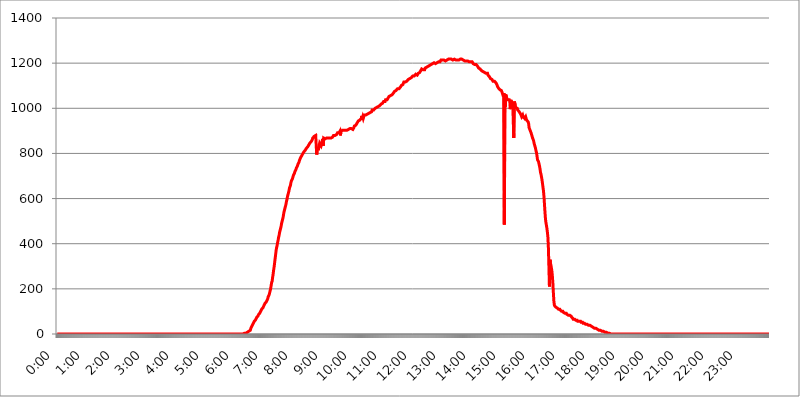
| Category | 2015.09.21. Intenzitás [W/m^2] |
|---|---|
| 0.0 | 0 |
| 0.0006944444444444445 | 0 |
| 0.001388888888888889 | 0 |
| 0.0020833333333333333 | 0 |
| 0.002777777777777778 | 0 |
| 0.003472222222222222 | 0 |
| 0.004166666666666667 | 0 |
| 0.004861111111111111 | 0 |
| 0.005555555555555556 | 0 |
| 0.0062499999999999995 | 0 |
| 0.006944444444444444 | 0 |
| 0.007638888888888889 | 0 |
| 0.008333333333333333 | 0 |
| 0.009027777777777779 | 0 |
| 0.009722222222222222 | 0 |
| 0.010416666666666666 | 0 |
| 0.011111111111111112 | 0 |
| 0.011805555555555555 | 0 |
| 0.012499999999999999 | 0 |
| 0.013194444444444444 | 0 |
| 0.013888888888888888 | 0 |
| 0.014583333333333332 | 0 |
| 0.015277777777777777 | 0 |
| 0.015972222222222224 | 0 |
| 0.016666666666666666 | 0 |
| 0.017361111111111112 | 0 |
| 0.018055555555555557 | 0 |
| 0.01875 | 0 |
| 0.019444444444444445 | 0 |
| 0.02013888888888889 | 0 |
| 0.020833333333333332 | 0 |
| 0.02152777777777778 | 0 |
| 0.022222222222222223 | 0 |
| 0.02291666666666667 | 0 |
| 0.02361111111111111 | 0 |
| 0.024305555555555556 | 0 |
| 0.024999999999999998 | 0 |
| 0.025694444444444447 | 0 |
| 0.02638888888888889 | 0 |
| 0.027083333333333334 | 0 |
| 0.027777777777777776 | 0 |
| 0.02847222222222222 | 0 |
| 0.029166666666666664 | 0 |
| 0.029861111111111113 | 0 |
| 0.030555555555555555 | 0 |
| 0.03125 | 0 |
| 0.03194444444444445 | 0 |
| 0.03263888888888889 | 0 |
| 0.03333333333333333 | 0 |
| 0.034027777777777775 | 0 |
| 0.034722222222222224 | 0 |
| 0.035416666666666666 | 0 |
| 0.036111111111111115 | 0 |
| 0.03680555555555556 | 0 |
| 0.0375 | 0 |
| 0.03819444444444444 | 0 |
| 0.03888888888888889 | 0 |
| 0.03958333333333333 | 0 |
| 0.04027777777777778 | 0 |
| 0.04097222222222222 | 0 |
| 0.041666666666666664 | 0 |
| 0.042361111111111106 | 0 |
| 0.04305555555555556 | 0 |
| 0.043750000000000004 | 0 |
| 0.044444444444444446 | 0 |
| 0.04513888888888889 | 0 |
| 0.04583333333333334 | 0 |
| 0.04652777777777778 | 0 |
| 0.04722222222222222 | 0 |
| 0.04791666666666666 | 0 |
| 0.04861111111111111 | 0 |
| 0.049305555555555554 | 0 |
| 0.049999999999999996 | 0 |
| 0.05069444444444445 | 0 |
| 0.051388888888888894 | 0 |
| 0.052083333333333336 | 0 |
| 0.05277777777777778 | 0 |
| 0.05347222222222222 | 0 |
| 0.05416666666666667 | 0 |
| 0.05486111111111111 | 0 |
| 0.05555555555555555 | 0 |
| 0.05625 | 0 |
| 0.05694444444444444 | 0 |
| 0.057638888888888885 | 0 |
| 0.05833333333333333 | 0 |
| 0.05902777777777778 | 0 |
| 0.059722222222222225 | 0 |
| 0.06041666666666667 | 0 |
| 0.061111111111111116 | 0 |
| 0.06180555555555556 | 0 |
| 0.0625 | 0 |
| 0.06319444444444444 | 0 |
| 0.06388888888888888 | 0 |
| 0.06458333333333334 | 0 |
| 0.06527777777777778 | 0 |
| 0.06597222222222222 | 0 |
| 0.06666666666666667 | 0 |
| 0.06736111111111111 | 0 |
| 0.06805555555555555 | 0 |
| 0.06874999999999999 | 0 |
| 0.06944444444444443 | 0 |
| 0.07013888888888889 | 0 |
| 0.07083333333333333 | 0 |
| 0.07152777777777779 | 0 |
| 0.07222222222222223 | 0 |
| 0.07291666666666667 | 0 |
| 0.07361111111111111 | 0 |
| 0.07430555555555556 | 0 |
| 0.075 | 0 |
| 0.07569444444444444 | 0 |
| 0.0763888888888889 | 0 |
| 0.07708333333333334 | 0 |
| 0.07777777777777778 | 0 |
| 0.07847222222222222 | 0 |
| 0.07916666666666666 | 0 |
| 0.0798611111111111 | 0 |
| 0.08055555555555556 | 0 |
| 0.08125 | 0 |
| 0.08194444444444444 | 0 |
| 0.08263888888888889 | 0 |
| 0.08333333333333333 | 0 |
| 0.08402777777777777 | 0 |
| 0.08472222222222221 | 0 |
| 0.08541666666666665 | 0 |
| 0.08611111111111112 | 0 |
| 0.08680555555555557 | 0 |
| 0.08750000000000001 | 0 |
| 0.08819444444444445 | 0 |
| 0.08888888888888889 | 0 |
| 0.08958333333333333 | 0 |
| 0.09027777777777778 | 0 |
| 0.09097222222222222 | 0 |
| 0.09166666666666667 | 0 |
| 0.09236111111111112 | 0 |
| 0.09305555555555556 | 0 |
| 0.09375 | 0 |
| 0.09444444444444444 | 0 |
| 0.09513888888888888 | 0 |
| 0.09583333333333333 | 0 |
| 0.09652777777777777 | 0 |
| 0.09722222222222222 | 0 |
| 0.09791666666666667 | 0 |
| 0.09861111111111111 | 0 |
| 0.09930555555555555 | 0 |
| 0.09999999999999999 | 0 |
| 0.10069444444444443 | 0 |
| 0.1013888888888889 | 0 |
| 0.10208333333333335 | 0 |
| 0.10277777777777779 | 0 |
| 0.10347222222222223 | 0 |
| 0.10416666666666667 | 0 |
| 0.10486111111111111 | 0 |
| 0.10555555555555556 | 0 |
| 0.10625 | 0 |
| 0.10694444444444444 | 0 |
| 0.1076388888888889 | 0 |
| 0.10833333333333334 | 0 |
| 0.10902777777777778 | 0 |
| 0.10972222222222222 | 0 |
| 0.1111111111111111 | 0 |
| 0.11180555555555556 | 0 |
| 0.11180555555555556 | 0 |
| 0.1125 | 0 |
| 0.11319444444444444 | 0 |
| 0.11388888888888889 | 0 |
| 0.11458333333333333 | 0 |
| 0.11527777777777777 | 0 |
| 0.11597222222222221 | 0 |
| 0.11666666666666665 | 0 |
| 0.1173611111111111 | 0 |
| 0.11805555555555557 | 0 |
| 0.11944444444444445 | 0 |
| 0.12013888888888889 | 0 |
| 0.12083333333333333 | 0 |
| 0.12152777777777778 | 0 |
| 0.12222222222222223 | 0 |
| 0.12291666666666667 | 0 |
| 0.12291666666666667 | 0 |
| 0.12361111111111112 | 0 |
| 0.12430555555555556 | 0 |
| 0.125 | 0 |
| 0.12569444444444444 | 0 |
| 0.12638888888888888 | 0 |
| 0.12708333333333333 | 0 |
| 0.16875 | 0 |
| 0.12847222222222224 | 0 |
| 0.12916666666666668 | 0 |
| 0.12986111111111112 | 0 |
| 0.13055555555555556 | 0 |
| 0.13125 | 0 |
| 0.13194444444444445 | 0 |
| 0.1326388888888889 | 0 |
| 0.13333333333333333 | 0 |
| 0.13402777777777777 | 0 |
| 0.13402777777777777 | 0 |
| 0.13472222222222222 | 0 |
| 0.13541666666666666 | 0 |
| 0.1361111111111111 | 0 |
| 0.13749999999999998 | 0 |
| 0.13819444444444443 | 0 |
| 0.1388888888888889 | 0 |
| 0.13958333333333334 | 0 |
| 0.14027777777777778 | 0 |
| 0.14097222222222222 | 0 |
| 0.14166666666666666 | 0 |
| 0.1423611111111111 | 0 |
| 0.14305555555555557 | 0 |
| 0.14375000000000002 | 0 |
| 0.14444444444444446 | 0 |
| 0.1451388888888889 | 0 |
| 0.1451388888888889 | 0 |
| 0.14652777777777778 | 0 |
| 0.14722222222222223 | 0 |
| 0.14791666666666667 | 0 |
| 0.1486111111111111 | 0 |
| 0.14930555555555555 | 0 |
| 0.15 | 0 |
| 0.15069444444444444 | 0 |
| 0.15138888888888888 | 0 |
| 0.15208333333333332 | 0 |
| 0.15277777777777776 | 0 |
| 0.15347222222222223 | 0 |
| 0.15416666666666667 | 0 |
| 0.15486111111111112 | 0 |
| 0.15555555555555556 | 0 |
| 0.15625 | 0 |
| 0.15694444444444444 | 0 |
| 0.15763888888888888 | 0 |
| 0.15833333333333333 | 0 |
| 0.15902777777777777 | 0 |
| 0.15972222222222224 | 0 |
| 0.16041666666666668 | 0 |
| 0.16111111111111112 | 0 |
| 0.16180555555555556 | 0 |
| 0.1625 | 0 |
| 0.16319444444444445 | 0 |
| 0.1638888888888889 | 0 |
| 0.16458333333333333 | 0 |
| 0.16527777777777777 | 0 |
| 0.16597222222222222 | 0 |
| 0.16666666666666666 | 0 |
| 0.1673611111111111 | 0 |
| 0.16805555555555554 | 0 |
| 0.16874999999999998 | 0 |
| 0.16944444444444443 | 0 |
| 0.17013888888888887 | 0 |
| 0.1708333333333333 | 0 |
| 0.17152777777777775 | 0 |
| 0.17222222222222225 | 0 |
| 0.1729166666666667 | 0 |
| 0.17361111111111113 | 0 |
| 0.17430555555555557 | 0 |
| 0.17500000000000002 | 0 |
| 0.17569444444444446 | 0 |
| 0.1763888888888889 | 0 |
| 0.17708333333333334 | 0 |
| 0.17777777777777778 | 0 |
| 0.17847222222222223 | 0 |
| 0.17916666666666667 | 0 |
| 0.1798611111111111 | 0 |
| 0.18055555555555555 | 0 |
| 0.18125 | 0 |
| 0.18194444444444444 | 0 |
| 0.1826388888888889 | 0 |
| 0.18333333333333335 | 0 |
| 0.1840277777777778 | 0 |
| 0.18472222222222223 | 0 |
| 0.18541666666666667 | 0 |
| 0.18611111111111112 | 0 |
| 0.18680555555555556 | 0 |
| 0.1875 | 0 |
| 0.18819444444444444 | 0 |
| 0.18888888888888888 | 0 |
| 0.18958333333333333 | 0 |
| 0.19027777777777777 | 0 |
| 0.1909722222222222 | 0 |
| 0.19166666666666665 | 0 |
| 0.19236111111111112 | 0 |
| 0.19305555555555554 | 0 |
| 0.19375 | 0 |
| 0.19444444444444445 | 0 |
| 0.1951388888888889 | 0 |
| 0.19583333333333333 | 0 |
| 0.19652777777777777 | 0 |
| 0.19722222222222222 | 0 |
| 0.19791666666666666 | 0 |
| 0.1986111111111111 | 0 |
| 0.19930555555555554 | 0 |
| 0.19999999999999998 | 0 |
| 0.20069444444444443 | 0 |
| 0.20138888888888887 | 0 |
| 0.2020833333333333 | 0 |
| 0.2027777777777778 | 0 |
| 0.2034722222222222 | 0 |
| 0.2041666666666667 | 0 |
| 0.20486111111111113 | 0 |
| 0.20555555555555557 | 0 |
| 0.20625000000000002 | 0 |
| 0.20694444444444446 | 0 |
| 0.2076388888888889 | 0 |
| 0.20833333333333334 | 0 |
| 0.20902777777777778 | 0 |
| 0.20972222222222223 | 0 |
| 0.21041666666666667 | 0 |
| 0.2111111111111111 | 0 |
| 0.21180555555555555 | 0 |
| 0.2125 | 0 |
| 0.21319444444444444 | 0 |
| 0.2138888888888889 | 0 |
| 0.21458333333333335 | 0 |
| 0.2152777777777778 | 0 |
| 0.21597222222222223 | 0 |
| 0.21666666666666667 | 0 |
| 0.21736111111111112 | 0 |
| 0.21805555555555556 | 0 |
| 0.21875 | 0 |
| 0.21944444444444444 | 0 |
| 0.22013888888888888 | 0 |
| 0.22083333333333333 | 0 |
| 0.22152777777777777 | 0 |
| 0.2222222222222222 | 0 |
| 0.22291666666666665 | 0 |
| 0.2236111111111111 | 0 |
| 0.22430555555555556 | 0 |
| 0.225 | 0 |
| 0.22569444444444445 | 0 |
| 0.2263888888888889 | 0 |
| 0.22708333333333333 | 0 |
| 0.22777777777777777 | 0 |
| 0.22847222222222222 | 0 |
| 0.22916666666666666 | 0 |
| 0.2298611111111111 | 0 |
| 0.23055555555555554 | 0 |
| 0.23124999999999998 | 0 |
| 0.23194444444444443 | 0 |
| 0.23263888888888887 | 0 |
| 0.2333333333333333 | 0 |
| 0.2340277777777778 | 0 |
| 0.2347222222222222 | 0 |
| 0.2354166666666667 | 0 |
| 0.23611111111111113 | 0 |
| 0.23680555555555557 | 0 |
| 0.23750000000000002 | 0 |
| 0.23819444444444446 | 0 |
| 0.2388888888888889 | 0 |
| 0.23958333333333334 | 0 |
| 0.24027777777777778 | 0 |
| 0.24097222222222223 | 0 |
| 0.24166666666666667 | 0 |
| 0.2423611111111111 | 0 |
| 0.24305555555555555 | 0 |
| 0.24375 | 0 |
| 0.24444444444444446 | 0 |
| 0.24513888888888888 | 0 |
| 0.24583333333333335 | 0 |
| 0.2465277777777778 | 0 |
| 0.24722222222222223 | 0 |
| 0.24791666666666667 | 0 |
| 0.24861111111111112 | 0 |
| 0.24930555555555556 | 0 |
| 0.25 | 0 |
| 0.25069444444444444 | 0 |
| 0.2513888888888889 | 0 |
| 0.2520833333333333 | 0 |
| 0.25277777777777777 | 0 |
| 0.2534722222222222 | 0 |
| 0.25416666666666665 | 0 |
| 0.2548611111111111 | 0 |
| 0.2555555555555556 | 0 |
| 0.25625000000000003 | 0 |
| 0.2569444444444445 | 0 |
| 0.2576388888888889 | 0 |
| 0.25833333333333336 | 0 |
| 0.2590277777777778 | 0 |
| 0.25972222222222224 | 0 |
| 0.2604166666666667 | 0 |
| 0.2611111111111111 | 0 |
| 0.26180555555555557 | 3.525 |
| 0.2625 | 3.525 |
| 0.26319444444444445 | 3.525 |
| 0.2638888888888889 | 3.525 |
| 0.26458333333333334 | 3.525 |
| 0.2652777777777778 | 3.525 |
| 0.2659722222222222 | 3.525 |
| 0.26666666666666666 | 7.887 |
| 0.2673611111111111 | 7.887 |
| 0.26805555555555555 | 7.887 |
| 0.26875 | 12.257 |
| 0.26944444444444443 | 12.257 |
| 0.2701388888888889 | 12.257 |
| 0.2708333333333333 | 16.636 |
| 0.27152777777777776 | 25.419 |
| 0.2722222222222222 | 25.419 |
| 0.27291666666666664 | 29.823 |
| 0.2736111111111111 | 38.653 |
| 0.2743055555555555 | 43.079 |
| 0.27499999999999997 | 47.511 |
| 0.27569444444444446 | 51.951 |
| 0.27638888888888885 | 56.398 |
| 0.27708333333333335 | 56.398 |
| 0.2777777777777778 | 60.85 |
| 0.27847222222222223 | 65.31 |
| 0.2791666666666667 | 69.775 |
| 0.2798611111111111 | 74.246 |
| 0.28055555555555556 | 74.246 |
| 0.28125 | 78.722 |
| 0.28194444444444444 | 83.205 |
| 0.2826388888888889 | 87.692 |
| 0.2833333333333333 | 87.692 |
| 0.28402777777777777 | 92.184 |
| 0.2847222222222222 | 96.682 |
| 0.28541666666666665 | 101.184 |
| 0.28611111111111115 | 105.69 |
| 0.28680555555555554 | 110.201 |
| 0.28750000000000003 | 110.201 |
| 0.2881944444444445 | 114.716 |
| 0.2888888888888889 | 119.235 |
| 0.28958333333333336 | 123.758 |
| 0.2902777777777778 | 128.284 |
| 0.29097222222222224 | 128.284 |
| 0.2916666666666667 | 137.347 |
| 0.2923611111111111 | 137.347 |
| 0.29305555555555557 | 141.884 |
| 0.29375 | 146.423 |
| 0.29444444444444445 | 150.964 |
| 0.2951388888888889 | 155.509 |
| 0.29583333333333334 | 164.605 |
| 0.2965277777777778 | 164.605 |
| 0.2972222222222222 | 173.709 |
| 0.29791666666666666 | 182.82 |
| 0.2986111111111111 | 191.937 |
| 0.29930555555555555 | 201.058 |
| 0.3 | 214.746 |
| 0.30069444444444443 | 228.436 |
| 0.3013888888888889 | 233 |
| 0.3020833333333333 | 251.251 |
| 0.30277777777777776 | 264.932 |
| 0.3034722222222222 | 283.156 |
| 0.30416666666666664 | 296.808 |
| 0.3048611111111111 | 314.98 |
| 0.3055555555555555 | 333.113 |
| 0.30624999999999997 | 351.198 |
| 0.3069444444444444 | 369.23 |
| 0.3076388888888889 | 382.715 |
| 0.30833333333333335 | 391.685 |
| 0.3090277777777778 | 405.108 |
| 0.30972222222222223 | 414.035 |
| 0.3104166666666667 | 427.39 |
| 0.3111111111111111 | 436.27 |
| 0.31180555555555556 | 449.551 |
| 0.3125 | 453.968 |
| 0.31319444444444444 | 467.187 |
| 0.3138888888888889 | 475.972 |
| 0.3145833333333333 | 489.108 |
| 0.31527777777777777 | 497.836 |
| 0.3159722222222222 | 506.542 |
| 0.31666666666666665 | 515.223 |
| 0.31736111111111115 | 528.2 |
| 0.31805555555555554 | 541.121 |
| 0.31875000000000003 | 549.704 |
| 0.3194444444444445 | 558.261 |
| 0.3201388888888889 | 566.793 |
| 0.32083333333333336 | 575.299 |
| 0.3215277777777778 | 588.009 |
| 0.32222222222222224 | 596.45 |
| 0.3229166666666667 | 609.062 |
| 0.3236111111111111 | 617.436 |
| 0.32430555555555557 | 625.784 |
| 0.325 | 634.105 |
| 0.32569444444444445 | 646.537 |
| 0.3263888888888889 | 650.667 |
| 0.32708333333333334 | 658.909 |
| 0.3277777777777778 | 671.22 |
| 0.3284722222222222 | 679.395 |
| 0.32916666666666666 | 683.473 |
| 0.3298611111111111 | 687.544 |
| 0.33055555555555555 | 695.666 |
| 0.33125 | 703.762 |
| 0.33194444444444443 | 707.8 |
| 0.3326388888888889 | 711.832 |
| 0.3333333333333333 | 719.877 |
| 0.3340277777777778 | 719.877 |
| 0.3347222222222222 | 727.896 |
| 0.3354166666666667 | 735.89 |
| 0.3361111111111111 | 739.877 |
| 0.3368055555555556 | 743.859 |
| 0.33749999999999997 | 751.803 |
| 0.33819444444444446 | 755.766 |
| 0.33888888888888885 | 759.723 |
| 0.33958333333333335 | 767.62 |
| 0.34027777777777773 | 767.62 |
| 0.34097222222222223 | 779.42 |
| 0.3416666666666666 | 783.342 |
| 0.3423611111111111 | 783.342 |
| 0.3430555555555555 | 791.169 |
| 0.34375 | 795.074 |
| 0.3444444444444445 | 798.974 |
| 0.3451388888888889 | 802.868 |
| 0.3458333333333334 | 806.757 |
| 0.34652777777777777 | 810.641 |
| 0.34722222222222227 | 810.641 |
| 0.34791666666666665 | 814.519 |
| 0.34861111111111115 | 818.392 |
| 0.34930555555555554 | 822.26 |
| 0.35000000000000003 | 826.123 |
| 0.3506944444444444 | 826.123 |
| 0.3513888888888889 | 829.981 |
| 0.3520833333333333 | 833.834 |
| 0.3527777777777778 | 837.682 |
| 0.3534722222222222 | 841.526 |
| 0.3541666666666667 | 845.365 |
| 0.3548611111111111 | 849.199 |
| 0.35555555555555557 | 849.199 |
| 0.35625 | 853.029 |
| 0.35694444444444445 | 856.855 |
| 0.3576388888888889 | 860.676 |
| 0.35833333333333334 | 868.305 |
| 0.3590277777777778 | 868.305 |
| 0.3597222222222222 | 872.114 |
| 0.36041666666666666 | 875.918 |
| 0.3611111111111111 | 875.918 |
| 0.36180555555555555 | 879.719 |
| 0.3625 | 879.719 |
| 0.36319444444444443 | 879.719 |
| 0.3638888888888889 | 795.074 |
| 0.3645833333333333 | 818.392 |
| 0.3652777777777778 | 826.123 |
| 0.3659722222222222 | 814.519 |
| 0.3666666666666667 | 818.392 |
| 0.3673611111111111 | 833.834 |
| 0.3680555555555556 | 845.365 |
| 0.36874999999999997 | 845.365 |
| 0.36944444444444446 | 845.365 |
| 0.37013888888888885 | 833.834 |
| 0.37083333333333335 | 841.526 |
| 0.37152777777777773 | 845.365 |
| 0.37222222222222223 | 864.493 |
| 0.3729166666666666 | 833.834 |
| 0.3736111111111111 | 868.305 |
| 0.3743055555555555 | 868.305 |
| 0.375 | 864.493 |
| 0.3756944444444445 | 864.493 |
| 0.3763888888888889 | 868.305 |
| 0.3770833333333334 | 864.493 |
| 0.37777777777777777 | 868.305 |
| 0.37847222222222227 | 868.305 |
| 0.37916666666666665 | 868.305 |
| 0.37986111111111115 | 868.305 |
| 0.38055555555555554 | 864.493 |
| 0.38125000000000003 | 868.305 |
| 0.3819444444444444 | 868.305 |
| 0.3826388888888889 | 872.114 |
| 0.3833333333333333 | 872.114 |
| 0.3840277777777778 | 868.305 |
| 0.3847222222222222 | 872.114 |
| 0.3854166666666667 | 872.114 |
| 0.3861111111111111 | 872.114 |
| 0.38680555555555557 | 875.918 |
| 0.3875 | 879.719 |
| 0.38819444444444445 | 879.719 |
| 0.3888888888888889 | 879.719 |
| 0.38958333333333334 | 879.719 |
| 0.3902777777777778 | 883.516 |
| 0.3909722222222222 | 883.516 |
| 0.39166666666666666 | 883.516 |
| 0.3923611111111111 | 887.309 |
| 0.39305555555555555 | 891.099 |
| 0.39375 | 891.099 |
| 0.39444444444444443 | 894.885 |
| 0.3951388888888889 | 891.099 |
| 0.3958333333333333 | 894.885 |
| 0.3965277777777778 | 898.668 |
| 0.3972222222222222 | 879.719 |
| 0.3979166666666667 | 898.668 |
| 0.3986111111111111 | 898.668 |
| 0.3993055555555556 | 902.447 |
| 0.39999999999999997 | 902.447 |
| 0.40069444444444446 | 902.447 |
| 0.40138888888888885 | 898.668 |
| 0.40208333333333335 | 902.447 |
| 0.40277777777777773 | 902.447 |
| 0.40347222222222223 | 906.223 |
| 0.4041666666666666 | 902.447 |
| 0.4048611111111111 | 906.223 |
| 0.4055555555555555 | 906.223 |
| 0.40625 | 902.447 |
| 0.4069444444444445 | 902.447 |
| 0.4076388888888889 | 902.447 |
| 0.4083333333333334 | 906.223 |
| 0.40902777777777777 | 906.223 |
| 0.40972222222222227 | 906.223 |
| 0.41041666666666665 | 909.996 |
| 0.41111111111111115 | 909.996 |
| 0.41180555555555554 | 906.223 |
| 0.41250000000000003 | 909.996 |
| 0.4131944444444444 | 909.996 |
| 0.4138888888888889 | 913.766 |
| 0.4145833333333333 | 906.223 |
| 0.4152777777777778 | 906.223 |
| 0.4159722222222222 | 913.766 |
| 0.4166666666666667 | 921.298 |
| 0.4173611111111111 | 917.534 |
| 0.41805555555555557 | 921.298 |
| 0.41875 | 925.06 |
| 0.41944444444444445 | 928.819 |
| 0.4201388888888889 | 932.576 |
| 0.42083333333333334 | 928.819 |
| 0.4215277777777778 | 936.33 |
| 0.4222222222222222 | 943.832 |
| 0.42291666666666666 | 940.082 |
| 0.4236111111111111 | 947.58 |
| 0.42430555555555555 | 947.58 |
| 0.425 | 951.327 |
| 0.42569444444444443 | 947.58 |
| 0.4263888888888889 | 955.071 |
| 0.4270833333333333 | 966.295 |
| 0.4277777777777778 | 955.071 |
| 0.4284722222222222 | 962.555 |
| 0.4291666666666667 | 955.071 |
| 0.4298611111111111 | 958.814 |
| 0.4305555555555556 | 970.034 |
| 0.43124999999999997 | 970.034 |
| 0.43194444444444446 | 970.034 |
| 0.43263888888888885 | 970.034 |
| 0.43333333333333335 | 970.034 |
| 0.43402777777777773 | 973.772 |
| 0.43472222222222223 | 973.772 |
| 0.4354166666666666 | 977.508 |
| 0.4361111111111111 | 977.508 |
| 0.4368055555555555 | 977.508 |
| 0.4375 | 977.508 |
| 0.4381944444444445 | 981.244 |
| 0.4388888888888889 | 981.244 |
| 0.4395833333333334 | 981.244 |
| 0.44027777777777777 | 981.244 |
| 0.44097222222222227 | 984.98 |
| 0.44166666666666665 | 992.448 |
| 0.44236111111111115 | 992.448 |
| 0.44305555555555554 | 988.714 |
| 0.44375000000000003 | 992.448 |
| 0.4444444444444444 | 992.448 |
| 0.4451388888888889 | 996.182 |
| 0.4458333333333333 | 999.916 |
| 0.4465277777777778 | 999.916 |
| 0.4472222222222222 | 999.916 |
| 0.4479166666666667 | 1003.65 |
| 0.4486111111111111 | 1003.65 |
| 0.44930555555555557 | 1003.65 |
| 0.45 | 1007.383 |
| 0.45069444444444445 | 1007.383 |
| 0.4513888888888889 | 1007.383 |
| 0.45208333333333334 | 1011.118 |
| 0.4527777777777778 | 1014.852 |
| 0.4534722222222222 | 1014.852 |
| 0.45416666666666666 | 1018.587 |
| 0.4548611111111111 | 1018.587 |
| 0.45555555555555555 | 1014.852 |
| 0.45625 | 1022.323 |
| 0.45694444444444443 | 1022.323 |
| 0.4576388888888889 | 1029.798 |
| 0.4583333333333333 | 1029.798 |
| 0.4590277777777778 | 1029.798 |
| 0.4597222222222222 | 1029.798 |
| 0.4604166666666667 | 1037.277 |
| 0.4611111111111111 | 1037.277 |
| 0.4618055555555556 | 1037.277 |
| 0.46249999999999997 | 1037.277 |
| 0.46319444444444446 | 1041.019 |
| 0.46388888888888885 | 1044.762 |
| 0.46458333333333335 | 1044.762 |
| 0.46527777777777773 | 1052.255 |
| 0.46597222222222223 | 1052.255 |
| 0.4666666666666666 | 1056.004 |
| 0.4673611111111111 | 1056.004 |
| 0.4680555555555555 | 1056.004 |
| 0.46875 | 1059.756 |
| 0.4694444444444445 | 1059.756 |
| 0.4701388888888889 | 1059.756 |
| 0.4708333333333334 | 1063.51 |
| 0.47152777777777777 | 1067.267 |
| 0.47222222222222227 | 1067.267 |
| 0.47291666666666665 | 1074.789 |
| 0.47361111111111115 | 1074.789 |
| 0.47430555555555554 | 1074.789 |
| 0.47500000000000003 | 1078.555 |
| 0.4756944444444444 | 1078.555 |
| 0.4763888888888889 | 1078.555 |
| 0.4770833333333333 | 1086.097 |
| 0.4777777777777778 | 1082.324 |
| 0.4784722222222222 | 1086.097 |
| 0.4791666666666667 | 1086.097 |
| 0.4798611111111111 | 1089.873 |
| 0.48055555555555557 | 1089.873 |
| 0.48125 | 1093.653 |
| 0.48194444444444445 | 1097.437 |
| 0.4826388888888889 | 1101.226 |
| 0.48333333333333334 | 1101.226 |
| 0.4840277777777778 | 1101.226 |
| 0.4847222222222222 | 1105.019 |
| 0.48541666666666666 | 1108.816 |
| 0.4861111111111111 | 1116.426 |
| 0.48680555555555555 | 1112.618 |
| 0.4875 | 1112.618 |
| 0.48819444444444443 | 1116.426 |
| 0.4888888888888889 | 1116.426 |
| 0.4895833333333333 | 1120.238 |
| 0.4902777777777778 | 1120.238 |
| 0.4909722222222222 | 1124.056 |
| 0.4916666666666667 | 1124.056 |
| 0.4923611111111111 | 1127.879 |
| 0.4930555555555556 | 1127.879 |
| 0.49374999999999997 | 1131.708 |
| 0.49444444444444446 | 1131.708 |
| 0.49513888888888885 | 1131.708 |
| 0.49583333333333335 | 1131.708 |
| 0.49652777777777773 | 1135.543 |
| 0.49722222222222223 | 1135.543 |
| 0.4979166666666666 | 1139.384 |
| 0.4986111111111111 | 1143.232 |
| 0.4993055555555555 | 1143.232 |
| 0.5 | 1143.232 |
| 0.5006944444444444 | 1143.232 |
| 0.5013888888888889 | 1147.086 |
| 0.5020833333333333 | 1147.086 |
| 0.5027777777777778 | 1150.946 |
| 0.5034722222222222 | 1147.086 |
| 0.5041666666666667 | 1147.086 |
| 0.5048611111111111 | 1147.086 |
| 0.5055555555555555 | 1147.086 |
| 0.50625 | 1154.814 |
| 0.5069444444444444 | 1154.814 |
| 0.5076388888888889 | 1158.689 |
| 0.5083333333333333 | 1158.689 |
| 0.5090277777777777 | 1162.571 |
| 0.5097222222222222 | 1166.46 |
| 0.5104166666666666 | 1170.358 |
| 0.5111111111111112 | 1174.263 |
| 0.5118055555555555 | 1174.263 |
| 0.5125000000000001 | 1170.358 |
| 0.5131944444444444 | 1170.358 |
| 0.513888888888889 | 1174.263 |
| 0.5145833333333333 | 1174.263 |
| 0.5152777777777778 | 1170.358 |
| 0.5159722222222222 | 1178.177 |
| 0.5166666666666667 | 1178.177 |
| 0.517361111111111 | 1178.177 |
| 0.5180555555555556 | 1182.099 |
| 0.5187499999999999 | 1186.03 |
| 0.5194444444444445 | 1182.099 |
| 0.5201388888888888 | 1186.03 |
| 0.5208333333333334 | 1186.03 |
| 0.5215277777777778 | 1186.03 |
| 0.5222222222222223 | 1189.969 |
| 0.5229166666666667 | 1189.969 |
| 0.5236111111111111 | 1189.969 |
| 0.5243055555555556 | 1193.918 |
| 0.525 | 1193.918 |
| 0.5256944444444445 | 1189.969 |
| 0.5263888888888889 | 1197.876 |
| 0.5270833333333333 | 1201.843 |
| 0.5277777777777778 | 1201.843 |
| 0.5284722222222222 | 1201.843 |
| 0.5291666666666667 | 1197.876 |
| 0.5298611111111111 | 1197.876 |
| 0.5305555555555556 | 1197.876 |
| 0.53125 | 1201.843 |
| 0.5319444444444444 | 1197.876 |
| 0.5326388888888889 | 1201.843 |
| 0.5333333333333333 | 1201.843 |
| 0.5340277777777778 | 1201.843 |
| 0.5347222222222222 | 1205.82 |
| 0.5354166666666667 | 1205.82 |
| 0.5361111111111111 | 1205.82 |
| 0.5368055555555555 | 1205.82 |
| 0.5375 | 1209.807 |
| 0.5381944444444444 | 1213.804 |
| 0.5388888888888889 | 1213.804 |
| 0.5395833333333333 | 1213.804 |
| 0.5402777777777777 | 1213.804 |
| 0.5409722222222222 | 1213.804 |
| 0.5416666666666666 | 1217.812 |
| 0.5423611111111112 | 1213.804 |
| 0.5430555555555555 | 1213.804 |
| 0.5437500000000001 | 1209.807 |
| 0.5444444444444444 | 1209.807 |
| 0.545138888888889 | 1209.807 |
| 0.5458333333333333 | 1213.804 |
| 0.5465277777777778 | 1213.804 |
| 0.5472222222222222 | 1213.804 |
| 0.5479166666666667 | 1217.812 |
| 0.548611111111111 | 1217.812 |
| 0.5493055555555556 | 1217.812 |
| 0.5499999999999999 | 1217.812 |
| 0.5506944444444445 | 1217.812 |
| 0.5513888888888888 | 1217.812 |
| 0.5520833333333334 | 1217.812 |
| 0.5527777777777778 | 1217.812 |
| 0.5534722222222223 | 1217.812 |
| 0.5541666666666667 | 1213.804 |
| 0.5548611111111111 | 1213.804 |
| 0.5555555555555556 | 1213.804 |
| 0.55625 | 1217.812 |
| 0.5569444444444445 | 1217.812 |
| 0.5576388888888889 | 1217.812 |
| 0.5583333333333333 | 1217.812 |
| 0.5590277777777778 | 1213.804 |
| 0.5597222222222222 | 1217.812 |
| 0.5604166666666667 | 1217.812 |
| 0.5611111111111111 | 1213.804 |
| 0.5618055555555556 | 1209.807 |
| 0.5625 | 1209.807 |
| 0.5631944444444444 | 1213.804 |
| 0.5638888888888889 | 1213.804 |
| 0.5645833333333333 | 1217.812 |
| 0.5652777777777778 | 1217.812 |
| 0.5659722222222222 | 1213.804 |
| 0.5666666666666667 | 1213.804 |
| 0.5673611111111111 | 1217.812 |
| 0.5680555555555555 | 1217.812 |
| 0.56875 | 1213.804 |
| 0.5694444444444444 | 1213.804 |
| 0.5701388888888889 | 1213.804 |
| 0.5708333333333333 | 1213.804 |
| 0.5715277777777777 | 1209.807 |
| 0.5722222222222222 | 1209.807 |
| 0.5729166666666666 | 1205.82 |
| 0.5736111111111112 | 1209.807 |
| 0.5743055555555555 | 1209.807 |
| 0.5750000000000001 | 1209.807 |
| 0.5756944444444444 | 1209.807 |
| 0.576388888888889 | 1209.807 |
| 0.5770833333333333 | 1205.82 |
| 0.5777777777777778 | 1205.82 |
| 0.5784722222222222 | 1205.82 |
| 0.5791666666666667 | 1209.807 |
| 0.579861111111111 | 1205.82 |
| 0.5805555555555556 | 1205.82 |
| 0.5812499999999999 | 1205.82 |
| 0.5819444444444445 | 1205.82 |
| 0.5826388888888888 | 1201.843 |
| 0.5833333333333334 | 1197.876 |
| 0.5840277777777778 | 1201.843 |
| 0.5847222222222223 | 1197.876 |
| 0.5854166666666667 | 1193.918 |
| 0.5861111111111111 | 1193.918 |
| 0.5868055555555556 | 1193.918 |
| 0.5875 | 1193.918 |
| 0.5881944444444445 | 1193.918 |
| 0.5888888888888889 | 1189.969 |
| 0.5895833333333333 | 1186.03 |
| 0.5902777777777778 | 1182.099 |
| 0.5909722222222222 | 1178.177 |
| 0.5916666666666667 | 1178.177 |
| 0.5923611111111111 | 1174.263 |
| 0.5930555555555556 | 1174.263 |
| 0.59375 | 1170.358 |
| 0.5944444444444444 | 1170.358 |
| 0.5951388888888889 | 1166.46 |
| 0.5958333333333333 | 1166.46 |
| 0.5965277777777778 | 1162.571 |
| 0.5972222222222222 | 1162.571 |
| 0.5979166666666667 | 1162.571 |
| 0.5986111111111111 | 1162.571 |
| 0.5993055555555555 | 1158.689 |
| 0.6 | 1162.571 |
| 0.6006944444444444 | 1158.689 |
| 0.6013888888888889 | 1154.814 |
| 0.6020833333333333 | 1154.814 |
| 0.6027777777777777 | 1154.814 |
| 0.6034722222222222 | 1154.814 |
| 0.6041666666666666 | 1147.086 |
| 0.6048611111111112 | 1143.232 |
| 0.6055555555555555 | 1143.232 |
| 0.6062500000000001 | 1139.384 |
| 0.6069444444444444 | 1135.543 |
| 0.607638888888889 | 1131.708 |
| 0.6083333333333333 | 1131.708 |
| 0.6090277777777778 | 1127.879 |
| 0.6097222222222222 | 1127.879 |
| 0.6104166666666667 | 1127.879 |
| 0.611111111111111 | 1120.238 |
| 0.6118055555555556 | 1124.056 |
| 0.6124999999999999 | 1124.056 |
| 0.6131944444444445 | 1120.238 |
| 0.6138888888888888 | 1120.238 |
| 0.6145833333333334 | 1116.426 |
| 0.6152777777777778 | 1112.618 |
| 0.6159722222222223 | 1108.816 |
| 0.6166666666666667 | 1105.019 |
| 0.6173611111111111 | 1097.437 |
| 0.6180555555555556 | 1101.226 |
| 0.61875 | 1089.873 |
| 0.6194444444444445 | 1089.873 |
| 0.6201388888888889 | 1086.097 |
| 0.6208333333333333 | 1082.324 |
| 0.6215277777777778 | 1086.097 |
| 0.6222222222222222 | 1082.324 |
| 0.6229166666666667 | 1078.555 |
| 0.6236111111111111 | 1074.789 |
| 0.6243055555555556 | 1067.267 |
| 0.625 | 1071.027 |
| 0.6256944444444444 | 1052.255 |
| 0.6263888888888889 | 1067.267 |
| 0.6270833333333333 | 484.735 |
| 0.6277777777777778 | 1063.51 |
| 0.6284722222222222 | 1007.383 |
| 0.6291666666666667 | 1059.756 |
| 0.6298611111111111 | 1048.508 |
| 0.6305555555555555 | 1048.508 |
| 0.63125 | 1044.762 |
| 0.6319444444444444 | 1037.277 |
| 0.6326388888888889 | 1037.277 |
| 0.6333333333333333 | 1041.019 |
| 0.6340277777777777 | 1037.277 |
| 0.6347222222222222 | 1029.798 |
| 0.6354166666666666 | 996.182 |
| 0.6361111111111112 | 1037.277 |
| 0.6368055555555555 | 1029.798 |
| 0.6375000000000001 | 1026.06 |
| 0.6381944444444444 | 1026.06 |
| 0.638888888888889 | 1022.323 |
| 0.6395833333333333 | 1018.587 |
| 0.6402777777777778 | 868.305 |
| 0.6409722222222222 | 1029.798 |
| 0.6416666666666667 | 1026.06 |
| 0.642361111111111 | 1014.852 |
| 0.6430555555555556 | 1003.65 |
| 0.6437499999999999 | 1003.65 |
| 0.6444444444444445 | 1003.65 |
| 0.6451388888888888 | 999.916 |
| 0.6458333333333334 | 992.448 |
| 0.6465277777777778 | 992.448 |
| 0.6472222222222223 | 988.714 |
| 0.6479166666666667 | 984.98 |
| 0.6486111111111111 | 984.98 |
| 0.6493055555555556 | 981.244 |
| 0.65 | 973.772 |
| 0.6506944444444445 | 970.034 |
| 0.6513888888888889 | 962.555 |
| 0.6520833333333333 | 962.555 |
| 0.6527777777777778 | 970.034 |
| 0.6534722222222222 | 962.555 |
| 0.6541666666666667 | 962.555 |
| 0.6548611111111111 | 958.814 |
| 0.6555555555555556 | 955.071 |
| 0.65625 | 958.814 |
| 0.6569444444444444 | 962.555 |
| 0.6576388888888889 | 958.814 |
| 0.6583333333333333 | 947.58 |
| 0.6590277777777778 | 947.58 |
| 0.6597222222222222 | 943.832 |
| 0.6604166666666667 | 940.082 |
| 0.6611111111111111 | 932.576 |
| 0.6618055555555555 | 913.766 |
| 0.6625 | 913.766 |
| 0.6631944444444444 | 902.447 |
| 0.6638888888888889 | 898.668 |
| 0.6645833333333333 | 891.099 |
| 0.6652777777777777 | 883.516 |
| 0.6659722222222222 | 875.918 |
| 0.6666666666666666 | 868.305 |
| 0.6673611111111111 | 864.493 |
| 0.6680555555555556 | 856.855 |
| 0.6687500000000001 | 845.365 |
| 0.6694444444444444 | 837.682 |
| 0.6701388888888888 | 829.981 |
| 0.6708333333333334 | 822.26 |
| 0.6715277777777778 | 810.641 |
| 0.6722222222222222 | 802.868 |
| 0.6729166666666666 | 787.258 |
| 0.6736111111111112 | 771.559 |
| 0.6743055555555556 | 767.62 |
| 0.6749999999999999 | 763.674 |
| 0.6756944444444444 | 759.723 |
| 0.6763888888888889 | 743.859 |
| 0.6770833333333334 | 731.896 |
| 0.6777777777777777 | 715.858 |
| 0.6784722222222223 | 707.8 |
| 0.6791666666666667 | 695.666 |
| 0.6798611111111111 | 683.473 |
| 0.6805555555555555 | 667.123 |
| 0.68125 | 650.667 |
| 0.6819444444444445 | 634.105 |
| 0.6826388888888889 | 609.062 |
| 0.6833333333333332 | 575.299 |
| 0.6840277777777778 | 541.121 |
| 0.6847222222222222 | 510.885 |
| 0.6854166666666667 | 493.475 |
| 0.686111111111111 | 480.356 |
| 0.6868055555555556 | 467.187 |
| 0.6875 | 449.551 |
| 0.6881944444444444 | 427.39 |
| 0.688888888888889 | 378.224 |
| 0.6895833333333333 | 296.808 |
| 0.6902777777777778 | 210.182 |
| 0.6909722222222222 | 328.584 |
| 0.6916666666666668 | 314.98 |
| 0.6923611111111111 | 305.898 |
| 0.6930555555555555 | 292.259 |
| 0.69375 | 278.603 |
| 0.6944444444444445 | 255.813 |
| 0.6951388888888889 | 223.873 |
| 0.6958333333333333 | 182.82 |
| 0.6965277777777777 | 146.423 |
| 0.6972222222222223 | 128.284 |
| 0.6979166666666666 | 123.758 |
| 0.6986111111111111 | 123.758 |
| 0.6993055555555556 | 119.235 |
| 0.7000000000000001 | 119.235 |
| 0.7006944444444444 | 119.235 |
| 0.7013888888888888 | 114.716 |
| 0.7020833333333334 | 114.716 |
| 0.7027777777777778 | 110.201 |
| 0.7034722222222222 | 110.201 |
| 0.7041666666666666 | 110.201 |
| 0.7048611111111112 | 110.201 |
| 0.7055555555555556 | 105.69 |
| 0.7062499999999999 | 105.69 |
| 0.7069444444444444 | 101.184 |
| 0.7076388888888889 | 101.184 |
| 0.7083333333333334 | 101.184 |
| 0.7090277777777777 | 101.184 |
| 0.7097222222222223 | 96.682 |
| 0.7104166666666667 | 96.682 |
| 0.7111111111111111 | 96.682 |
| 0.7118055555555555 | 92.184 |
| 0.7125 | 92.184 |
| 0.7131944444444445 | 92.184 |
| 0.7138888888888889 | 92.184 |
| 0.7145833333333332 | 87.692 |
| 0.7152777777777778 | 87.692 |
| 0.7159722222222222 | 87.692 |
| 0.7166666666666667 | 83.205 |
| 0.717361111111111 | 83.205 |
| 0.7180555555555556 | 83.205 |
| 0.71875 | 83.205 |
| 0.7194444444444444 | 83.205 |
| 0.720138888888889 | 83.205 |
| 0.7208333333333333 | 78.722 |
| 0.7215277777777778 | 74.246 |
| 0.7222222222222222 | 74.246 |
| 0.7229166666666668 | 69.775 |
| 0.7236111111111111 | 65.31 |
| 0.7243055555555555 | 65.31 |
| 0.725 | 65.31 |
| 0.7256944444444445 | 65.31 |
| 0.7263888888888889 | 65.31 |
| 0.7270833333333333 | 60.85 |
| 0.7277777777777777 | 60.85 |
| 0.7284722222222223 | 60.85 |
| 0.7291666666666666 | 60.85 |
| 0.7298611111111111 | 56.398 |
| 0.7305555555555556 | 56.398 |
| 0.7312500000000001 | 56.398 |
| 0.7319444444444444 | 56.398 |
| 0.7326388888888888 | 56.398 |
| 0.7333333333333334 | 56.398 |
| 0.7340277777777778 | 56.398 |
| 0.7347222222222222 | 51.951 |
| 0.7354166666666666 | 51.951 |
| 0.7361111111111112 | 51.951 |
| 0.7368055555555556 | 51.951 |
| 0.7374999999999999 | 47.511 |
| 0.7381944444444444 | 47.511 |
| 0.7388888888888889 | 47.511 |
| 0.7395833333333334 | 47.511 |
| 0.7402777777777777 | 47.511 |
| 0.7409722222222223 | 43.079 |
| 0.7416666666666667 | 43.079 |
| 0.7423611111111111 | 43.079 |
| 0.7430555555555555 | 43.079 |
| 0.74375 | 38.653 |
| 0.7444444444444445 | 38.653 |
| 0.7451388888888889 | 38.653 |
| 0.7458333333333332 | 38.653 |
| 0.7465277777777778 | 38.653 |
| 0.7472222222222222 | 38.653 |
| 0.7479166666666667 | 34.234 |
| 0.748611111111111 | 34.234 |
| 0.7493055555555556 | 34.234 |
| 0.75 | 29.823 |
| 0.7506944444444444 | 29.823 |
| 0.751388888888889 | 29.823 |
| 0.7520833333333333 | 29.823 |
| 0.7527777777777778 | 25.419 |
| 0.7534722222222222 | 25.419 |
| 0.7541666666666668 | 25.419 |
| 0.7548611111111111 | 25.419 |
| 0.7555555555555555 | 25.419 |
| 0.75625 | 21.024 |
| 0.7569444444444445 | 21.024 |
| 0.7576388888888889 | 21.024 |
| 0.7583333333333333 | 21.024 |
| 0.7590277777777777 | 21.024 |
| 0.7597222222222223 | 16.636 |
| 0.7604166666666666 | 16.636 |
| 0.7611111111111111 | 16.636 |
| 0.7618055555555556 | 16.636 |
| 0.7625000000000001 | 16.636 |
| 0.7631944444444444 | 12.257 |
| 0.7638888888888888 | 12.257 |
| 0.7645833333333334 | 12.257 |
| 0.7652777777777778 | 12.257 |
| 0.7659722222222222 | 12.257 |
| 0.7666666666666666 | 7.887 |
| 0.7673611111111112 | 7.887 |
| 0.7680555555555556 | 7.887 |
| 0.7687499999999999 | 7.887 |
| 0.7694444444444444 | 7.887 |
| 0.7701388888888889 | 7.887 |
| 0.7708333333333334 | 3.525 |
| 0.7715277777777777 | 3.525 |
| 0.7722222222222223 | 3.525 |
| 0.7729166666666667 | 3.525 |
| 0.7736111111111111 | 3.525 |
| 0.7743055555555555 | 3.525 |
| 0.775 | 3.525 |
| 0.7756944444444445 | 3.525 |
| 0.7763888888888889 | 0 |
| 0.7770833333333332 | 0 |
| 0.7777777777777778 | 0 |
| 0.7784722222222222 | 0 |
| 0.7791666666666667 | 0 |
| 0.779861111111111 | 0 |
| 0.7805555555555556 | 0 |
| 0.78125 | 0 |
| 0.7819444444444444 | 0 |
| 0.782638888888889 | 0 |
| 0.7833333333333333 | 0 |
| 0.7840277777777778 | 0 |
| 0.7847222222222222 | 0 |
| 0.7854166666666668 | 0 |
| 0.7861111111111111 | 0 |
| 0.7868055555555555 | 0 |
| 0.7875 | 0 |
| 0.7881944444444445 | 0 |
| 0.7888888888888889 | 0 |
| 0.7895833333333333 | 0 |
| 0.7902777777777777 | 0 |
| 0.7909722222222223 | 0 |
| 0.7916666666666666 | 0 |
| 0.7923611111111111 | 0 |
| 0.7930555555555556 | 0 |
| 0.7937500000000001 | 0 |
| 0.7944444444444444 | 0 |
| 0.7951388888888888 | 0 |
| 0.7958333333333334 | 0 |
| 0.7965277777777778 | 0 |
| 0.7972222222222222 | 0 |
| 0.7979166666666666 | 0 |
| 0.7986111111111112 | 0 |
| 0.7993055555555556 | 0 |
| 0.7999999999999999 | 0 |
| 0.8006944444444444 | 0 |
| 0.8013888888888889 | 0 |
| 0.8020833333333334 | 0 |
| 0.8027777777777777 | 0 |
| 0.8034722222222223 | 0 |
| 0.8041666666666667 | 0 |
| 0.8048611111111111 | 0 |
| 0.8055555555555555 | 0 |
| 0.80625 | 0 |
| 0.8069444444444445 | 0 |
| 0.8076388888888889 | 0 |
| 0.8083333333333332 | 0 |
| 0.8090277777777778 | 0 |
| 0.8097222222222222 | 0 |
| 0.8104166666666667 | 0 |
| 0.811111111111111 | 0 |
| 0.8118055555555556 | 0 |
| 0.8125 | 0 |
| 0.8131944444444444 | 0 |
| 0.813888888888889 | 0 |
| 0.8145833333333333 | 0 |
| 0.8152777777777778 | 0 |
| 0.8159722222222222 | 0 |
| 0.8166666666666668 | 0 |
| 0.8173611111111111 | 0 |
| 0.8180555555555555 | 0 |
| 0.81875 | 0 |
| 0.8194444444444445 | 0 |
| 0.8201388888888889 | 0 |
| 0.8208333333333333 | 0 |
| 0.8215277777777777 | 0 |
| 0.8222222222222223 | 0 |
| 0.8229166666666666 | 0 |
| 0.8236111111111111 | 0 |
| 0.8243055555555556 | 0 |
| 0.8250000000000001 | 0 |
| 0.8256944444444444 | 0 |
| 0.8263888888888888 | 0 |
| 0.8270833333333334 | 0 |
| 0.8277777777777778 | 0 |
| 0.8284722222222222 | 0 |
| 0.8291666666666666 | 0 |
| 0.8298611111111112 | 0 |
| 0.8305555555555556 | 0 |
| 0.8312499999999999 | 0 |
| 0.8319444444444444 | 0 |
| 0.8326388888888889 | 0 |
| 0.8333333333333334 | 0 |
| 0.8340277777777777 | 0 |
| 0.8347222222222223 | 0 |
| 0.8354166666666667 | 0 |
| 0.8361111111111111 | 0 |
| 0.8368055555555555 | 0 |
| 0.8375 | 0 |
| 0.8381944444444445 | 0 |
| 0.8388888888888889 | 0 |
| 0.8395833333333332 | 0 |
| 0.8402777777777778 | 0 |
| 0.8409722222222222 | 0 |
| 0.8416666666666667 | 0 |
| 0.842361111111111 | 0 |
| 0.8430555555555556 | 0 |
| 0.84375 | 0 |
| 0.8444444444444444 | 0 |
| 0.845138888888889 | 0 |
| 0.8458333333333333 | 0 |
| 0.8465277777777778 | 0 |
| 0.8472222222222222 | 0 |
| 0.8479166666666668 | 0 |
| 0.8486111111111111 | 0 |
| 0.8493055555555555 | 0 |
| 0.85 | 0 |
| 0.8506944444444445 | 0 |
| 0.8513888888888889 | 0 |
| 0.8520833333333333 | 0 |
| 0.8527777777777777 | 0 |
| 0.8534722222222223 | 0 |
| 0.8541666666666666 | 0 |
| 0.8548611111111111 | 0 |
| 0.8555555555555556 | 0 |
| 0.8562500000000001 | 0 |
| 0.8569444444444444 | 0 |
| 0.8576388888888888 | 0 |
| 0.8583333333333334 | 0 |
| 0.8590277777777778 | 0 |
| 0.8597222222222222 | 0 |
| 0.8604166666666666 | 0 |
| 0.8611111111111112 | 0 |
| 0.8618055555555556 | 0 |
| 0.8624999999999999 | 0 |
| 0.8631944444444444 | 0 |
| 0.8638888888888889 | 0 |
| 0.8645833333333334 | 0 |
| 0.8652777777777777 | 0 |
| 0.8659722222222223 | 0 |
| 0.8666666666666667 | 0 |
| 0.8673611111111111 | 0 |
| 0.8680555555555555 | 0 |
| 0.86875 | 0 |
| 0.8694444444444445 | 0 |
| 0.8701388888888889 | 0 |
| 0.8708333333333332 | 0 |
| 0.8715277777777778 | 0 |
| 0.8722222222222222 | 0 |
| 0.8729166666666667 | 0 |
| 0.873611111111111 | 0 |
| 0.8743055555555556 | 0 |
| 0.875 | 0 |
| 0.8756944444444444 | 0 |
| 0.876388888888889 | 0 |
| 0.8770833333333333 | 0 |
| 0.8777777777777778 | 0 |
| 0.8784722222222222 | 0 |
| 0.8791666666666668 | 0 |
| 0.8798611111111111 | 0 |
| 0.8805555555555555 | 0 |
| 0.88125 | 0 |
| 0.8819444444444445 | 0 |
| 0.8826388888888889 | 0 |
| 0.8833333333333333 | 0 |
| 0.8840277777777777 | 0 |
| 0.8847222222222223 | 0 |
| 0.8854166666666666 | 0 |
| 0.8861111111111111 | 0 |
| 0.8868055555555556 | 0 |
| 0.8875000000000001 | 0 |
| 0.8881944444444444 | 0 |
| 0.8888888888888888 | 0 |
| 0.8895833333333334 | 0 |
| 0.8902777777777778 | 0 |
| 0.8909722222222222 | 0 |
| 0.8916666666666666 | 0 |
| 0.8923611111111112 | 0 |
| 0.8930555555555556 | 0 |
| 0.8937499999999999 | 0 |
| 0.8944444444444444 | 0 |
| 0.8951388888888889 | 0 |
| 0.8958333333333334 | 0 |
| 0.8965277777777777 | 0 |
| 0.8972222222222223 | 0 |
| 0.8979166666666667 | 0 |
| 0.8986111111111111 | 0 |
| 0.8993055555555555 | 0 |
| 0.9 | 0 |
| 0.9006944444444445 | 0 |
| 0.9013888888888889 | 0 |
| 0.9020833333333332 | 0 |
| 0.9027777777777778 | 0 |
| 0.9034722222222222 | 0 |
| 0.9041666666666667 | 0 |
| 0.904861111111111 | 0 |
| 0.9055555555555556 | 0 |
| 0.90625 | 0 |
| 0.9069444444444444 | 0 |
| 0.907638888888889 | 0 |
| 0.9083333333333333 | 0 |
| 0.9090277777777778 | 0 |
| 0.9097222222222222 | 0 |
| 0.9104166666666668 | 0 |
| 0.9111111111111111 | 0 |
| 0.9118055555555555 | 0 |
| 0.9125 | 0 |
| 0.9131944444444445 | 0 |
| 0.9138888888888889 | 0 |
| 0.9145833333333333 | 0 |
| 0.9152777777777777 | 0 |
| 0.9159722222222223 | 0 |
| 0.9166666666666666 | 0 |
| 0.9173611111111111 | 0 |
| 0.9180555555555556 | 0 |
| 0.9187500000000001 | 0 |
| 0.9194444444444444 | 0 |
| 0.9201388888888888 | 0 |
| 0.9208333333333334 | 0 |
| 0.9215277777777778 | 0 |
| 0.9222222222222222 | 0 |
| 0.9229166666666666 | 0 |
| 0.9236111111111112 | 0 |
| 0.9243055555555556 | 0 |
| 0.9249999999999999 | 0 |
| 0.9256944444444444 | 0 |
| 0.9263888888888889 | 0 |
| 0.9270833333333334 | 0 |
| 0.9277777777777777 | 0 |
| 0.9284722222222223 | 0 |
| 0.9291666666666667 | 0 |
| 0.9298611111111111 | 0 |
| 0.9305555555555555 | 0 |
| 0.93125 | 0 |
| 0.9319444444444445 | 0 |
| 0.9326388888888889 | 0 |
| 0.9333333333333332 | 0 |
| 0.9340277777777778 | 0 |
| 0.9347222222222222 | 0 |
| 0.9354166666666667 | 0 |
| 0.936111111111111 | 0 |
| 0.9368055555555556 | 0 |
| 0.9375 | 0 |
| 0.9381944444444444 | 0 |
| 0.938888888888889 | 0 |
| 0.9395833333333333 | 0 |
| 0.9402777777777778 | 0 |
| 0.9409722222222222 | 0 |
| 0.9416666666666668 | 0 |
| 0.9423611111111111 | 0 |
| 0.9430555555555555 | 0 |
| 0.94375 | 0 |
| 0.9444444444444445 | 0 |
| 0.9451388888888889 | 0 |
| 0.9458333333333333 | 0 |
| 0.9465277777777777 | 0 |
| 0.9472222222222223 | 0 |
| 0.9479166666666666 | 0 |
| 0.9486111111111111 | 0 |
| 0.9493055555555556 | 0 |
| 0.9500000000000001 | 0 |
| 0.9506944444444444 | 0 |
| 0.9513888888888888 | 0 |
| 0.9520833333333334 | 0 |
| 0.9527777777777778 | 0 |
| 0.9534722222222222 | 0 |
| 0.9541666666666666 | 0 |
| 0.9548611111111112 | 0 |
| 0.9555555555555556 | 0 |
| 0.9562499999999999 | 0 |
| 0.9569444444444444 | 0 |
| 0.9576388888888889 | 0 |
| 0.9583333333333334 | 0 |
| 0.9590277777777777 | 0 |
| 0.9597222222222223 | 0 |
| 0.9604166666666667 | 0 |
| 0.9611111111111111 | 0 |
| 0.9618055555555555 | 0 |
| 0.9625 | 0 |
| 0.9631944444444445 | 0 |
| 0.9638888888888889 | 0 |
| 0.9645833333333332 | 0 |
| 0.9652777777777778 | 0 |
| 0.9659722222222222 | 0 |
| 0.9666666666666667 | 0 |
| 0.967361111111111 | 0 |
| 0.9680555555555556 | 0 |
| 0.96875 | 0 |
| 0.9694444444444444 | 0 |
| 0.970138888888889 | 0 |
| 0.9708333333333333 | 0 |
| 0.9715277777777778 | 0 |
| 0.9722222222222222 | 0 |
| 0.9729166666666668 | 0 |
| 0.9736111111111111 | 0 |
| 0.9743055555555555 | 0 |
| 0.975 | 0 |
| 0.9756944444444445 | 0 |
| 0.9763888888888889 | 0 |
| 0.9770833333333333 | 0 |
| 0.9777777777777777 | 0 |
| 0.9784722222222223 | 0 |
| 0.9791666666666666 | 0 |
| 0.9798611111111111 | 0 |
| 0.9805555555555556 | 0 |
| 0.9812500000000001 | 0 |
| 0.9819444444444444 | 0 |
| 0.9826388888888888 | 0 |
| 0.9833333333333334 | 0 |
| 0.9840277777777778 | 0 |
| 0.9847222222222222 | 0 |
| 0.9854166666666666 | 0 |
| 0.9861111111111112 | 0 |
| 0.9868055555555556 | 0 |
| 0.9874999999999999 | 0 |
| 0.9881944444444444 | 0 |
| 0.9888888888888889 | 0 |
| 0.9895833333333334 | 0 |
| 0.9902777777777777 | 0 |
| 0.9909722222222223 | 0 |
| 0.9916666666666667 | 0 |
| 0.9923611111111111 | 0 |
| 0.9930555555555555 | 0 |
| 0.99375 | 0 |
| 0.9944444444444445 | 0 |
| 0.9951388888888889 | 0 |
| 0.9958333333333332 | 0 |
| 0.9965277777777778 | 0 |
| 0.9972222222222222 | 0 |
| 0.9979166666666667 | 0 |
| 0.998611111111111 | 0 |
| 0.9993055555555556 | 0 |